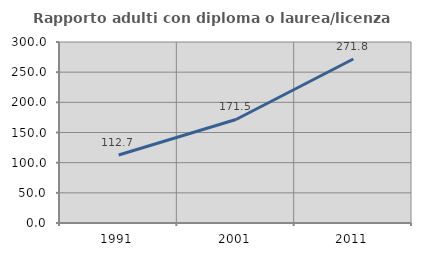
| Category | Rapporto adulti con diploma o laurea/licenza media  |
|---|---|
| 1991.0 | 112.665 |
| 2001.0 | 171.548 |
| 2011.0 | 271.783 |